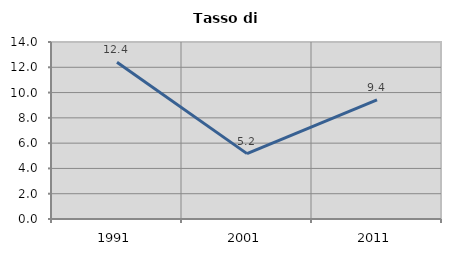
| Category | Tasso di disoccupazione   |
|---|---|
| 1991.0 | 12.403 |
| 2001.0 | 5.172 |
| 2011.0 | 9.42 |